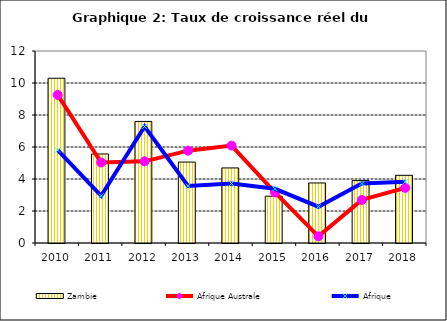
| Category | Zambie |
|---|---|
| 2010.0 | 10.298 |
| 2011.0 | 5.565 |
| 2012.0 | 7.598 |
| 2013.0 | 5.059 |
| 2014.0 | 4.692 |
| 2015.0 | 2.924 |
| 2016.0 | 3.752 |
| 2017.0 | 3.901 |
| 2018.0 | 4.23 |